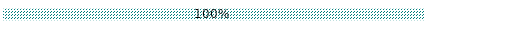
| Category | Conforme | Perfectible | Non conforme | Non concerné | À remplir |
|---|---|---|---|---|---|
| Conformité aux critères d'agrément N1 | 0 | 0 | 0 | 0 | 1 |